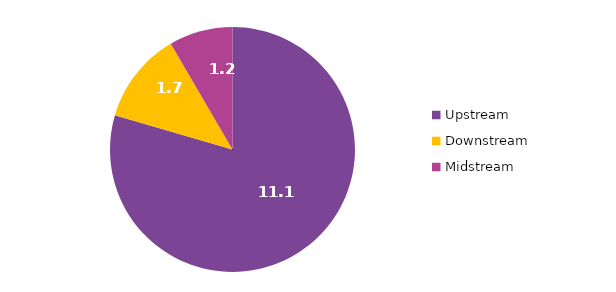
| Category | Series 0 |
|---|---|
| Upstream | 11.1 |
| Downstream | 1.686 |
| Midstream | 1.174 |